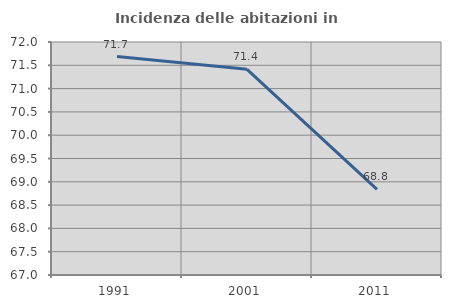
| Category | Incidenza delle abitazioni in proprietà  |
|---|---|
| 1991.0 | 71.687 |
| 2001.0 | 71.414 |
| 2011.0 | 68.838 |